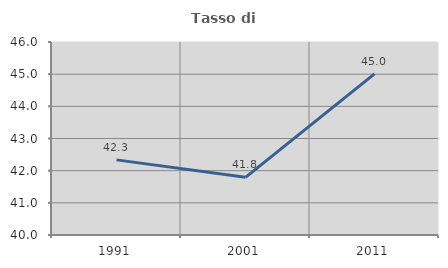
| Category | Tasso di occupazione   |
|---|---|
| 1991.0 | 42.336 |
| 2001.0 | 41.794 |
| 2011.0 | 45.009 |